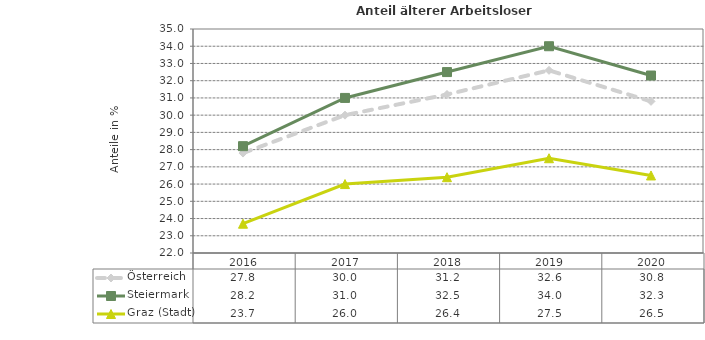
| Category | Österreich | Steiermark | Graz (Stadt) |
|---|---|---|---|
| 2020.0 | 30.8 | 32.3 | 26.5 |
| 2019.0 | 32.6 | 34 | 27.5 |
| 2018.0 | 31.2 | 32.5 | 26.4 |
| 2017.0 | 30 | 31 | 26 |
| 2016.0 | 27.8 | 28.2 | 23.7 |